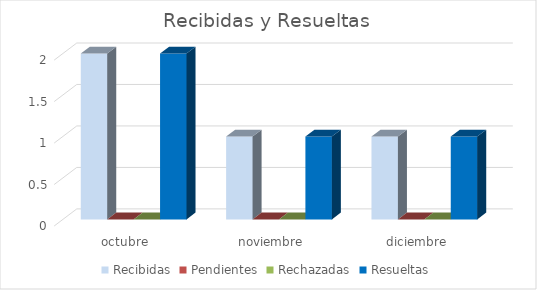
| Category | Recibidas | Pendientes | Rechazadas | Resueltas |
|---|---|---|---|---|
| octubre | 2 | 0 | 0 | 2 |
| noviembre | 1 | 0 | 0 | 1 |
| diciembre | 1 | 0 | 0 | 1 |